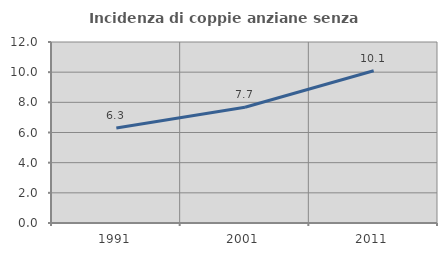
| Category | Incidenza di coppie anziane senza figli  |
|---|---|
| 1991.0 | 6.303 |
| 2001.0 | 7.678 |
| 2011.0 | 10.092 |